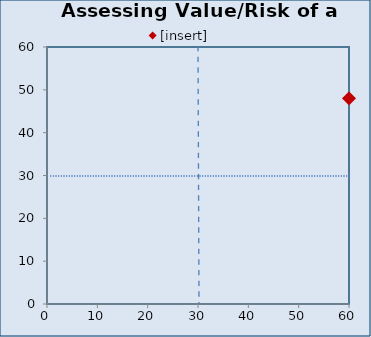
| Category | [insert] |
|---|---|
| 60.0 | 48 |